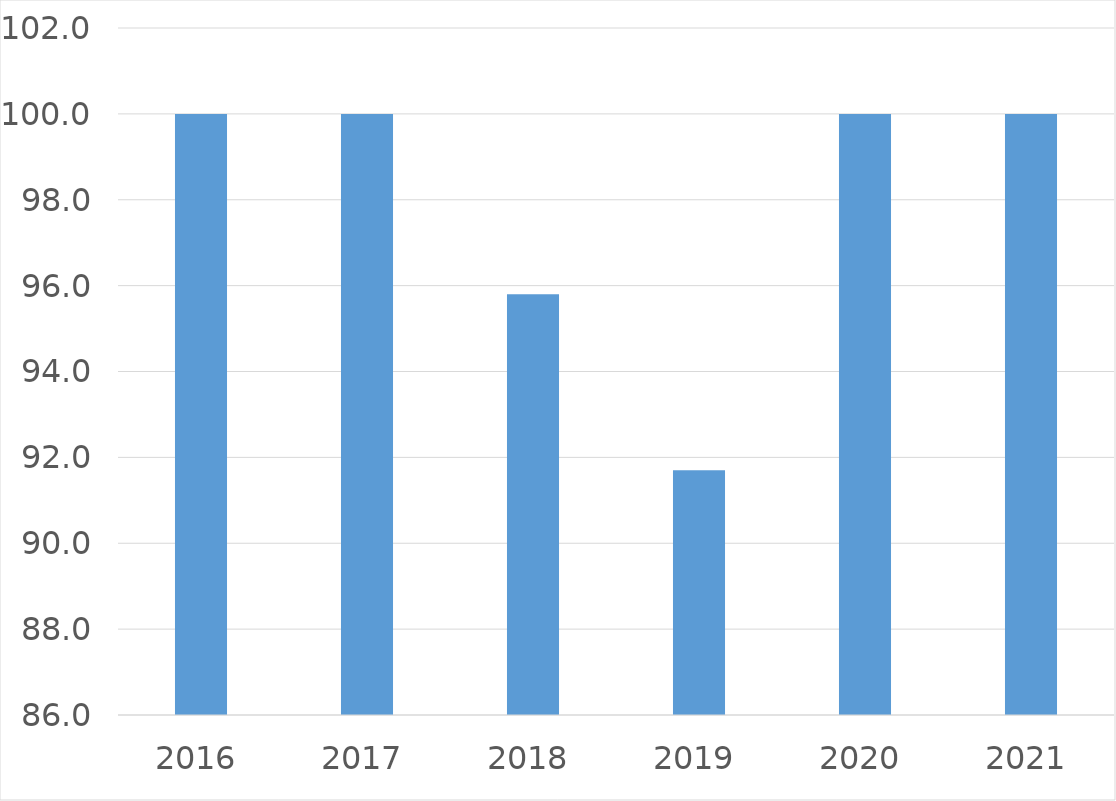
| Category | Series 0 |
|---|---|
| 2016 | 100 |
| 2017 | 100 |
| 2018 | 95.8 |
| 2019 | 91.7 |
| 2020 | 100 |
| 2021 | 100 |